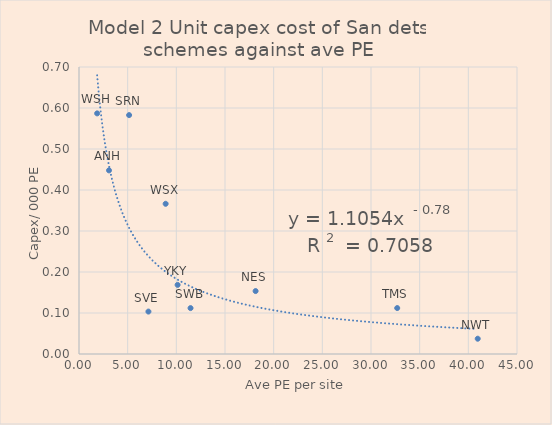
| Category | Series 0 |
|---|---|
| 3.082416666666667 | 0.448 |
| 18.144000000000002 | 0.154 |
| 40.96455505215858 | 0.037 |
| 5.147625 | 0.583 |
| 7.132917808219178 | 0.103 |
| 11.46 | 0.112 |
| 32.69297749687747 | 0.112 |
| 1.865 | 0.587 |
| 8.90272620078277 | 0.366 |
| 10.1314 | 0.169 |